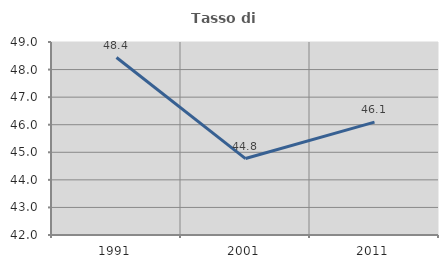
| Category | Tasso di occupazione   |
|---|---|
| 1991.0 | 48.438 |
| 2001.0 | 44.772 |
| 2011.0 | 46.093 |